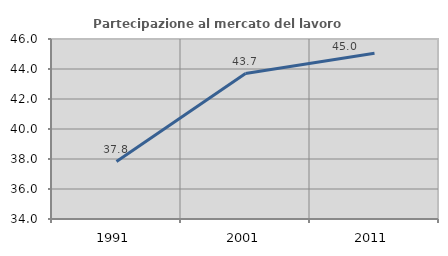
| Category | Partecipazione al mercato del lavoro  femminile |
|---|---|
| 1991.0 | 37.833 |
| 2001.0 | 43.694 |
| 2011.0 | 45.045 |